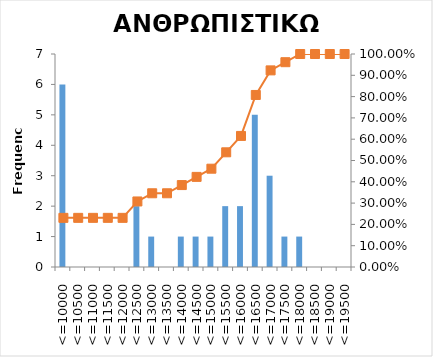
| Category | Series 0 |
|---|---|
| <=10000 | 6 |
| <=10500 | 0 |
| <=11000 | 0 |
| <=11500 | 0 |
| <=12000 | 0 |
| <=12500 | 2 |
| <=13000 | 1 |
| <=13500 | 0 |
| <=14000 | 1 |
| <=14500 | 1 |
| <=15000 | 1 |
| <=15500 | 2 |
| <=16000 | 2 |
| <=16500 | 5 |
| <=17000 | 3 |
| <=17500 | 1 |
| <=18000 | 1 |
| <=18500 | 0 |
| <=19000 | 0 |
| <=19500 | 0 |